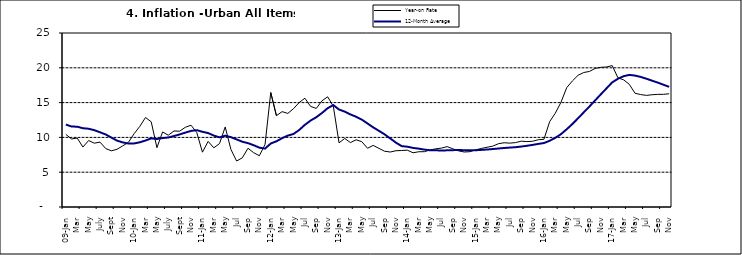
| Category | Year-on Rate | 12-Month Average |
|---|---|---|
| 09-Jan | 10.439 | 11.844 |
| Feb | 9.772 | 11.562 |
| Mar | 9.907 | 11.538 |
| Apr | 8.618 | 11.319 |
| May | 9.547 | 11.246 |
| June | 9.17 | 11.039 |
| July | 9.325 | 10.738 |
| Aug | 8.401 | 10.424 |
| Sept | 8.07 | 9.973 |
| Oct | 8.3 | 9.535 |
| Nov | 8.781 | 9.278 |
| Dec | 9.298 | 9.117 |
| 10-Jan | 10.534 | 9.136 |
| Feb | 11.584 | 9.297 |
| Mar | 12.864 | 9.555 |
| Apr | 12.24 | 9.859 |
| May | 8.524 | 9.769 |
| June | 10.781 | 9.904 |
| July | 10.313 | 9.987 |
| Aug | 10.924 | 10.197 |
| Sept | 10.891 | 10.43 |
| Oct | 11.457 | 10.689 |
| Nov | 11.748 | 10.932 |
| Dec | 10.699 | 11.042 |
| 11-Jan | 7.878 | 10.806 |
| Feb | 9.426 | 10.623 |
| Mar | 8.498 | 10.26 |
| Apr | 9.11 | 10.005 |
| May | 11.5 | 10.249 |
| Jun | 8.278 | 10.034 |
| Jul | 6.608 | 9.711 |
| Aug | 7.061 | 9.38 |
| Sep | 8.443 | 9.178 |
| Oct | 7.802 | 8.88 |
| Nov | 7.365 | 8.525 |
| Dec | 8.993 | 8.395 |
| 12-Jan | 16.445 | 9.119 |
| Feb | 13.123 | 9.443 |
| Mar | 13.701 | 9.889 |
| Apr | 13.447 | 10.259 |
| May | 14.127 | 10.496 |
| Jun | 15.012 | 11.062 |
| Jul | 15.63 | 11.81 |
| Aug | 14.456 | 12.422 |
| Sep | 14.162 | 12.893 |
| Oct | 15.26 | 13.506 |
| Nov | 15.836 | 14.199 |
| Dec | 14.459 | 14.637 |
| 13-Jan | 9.22 | 14.006 |
| Feb | 9.85 | 13.703 |
| Mar | 9.253 | 13.302 |
| Apr | 9.657 | 12.966 |
| May | 9.385 | 12.557 |
| Jun | 8.441 | 11.999 |
| Jul | 8.849 | 11.443 |
| Aug | 8.431 | 10.946 |
| Sep | 8.013 | 10.44 |
| Oct | 7.9 | 9.849 |
| Nov | 8.086 | 9.245 |
| Dec | 8.117 | 8.75 |
| 14-Jan | 8.164 | 8.662 |
| Feb | 7.791 | 8.493 |
| Mar | 7.937 | 8.384 |
| Apr | 7.947 | 8.246 |
| May | 8.195 | 8.151 |
| Jun | 8.358 | 8.146 |
| Jul | 8.464 | 8.118 |
| Aug | 8.673 | 8.141 |
| Sep | 8.357 | 8.17 |
| Oct | 8.064 | 8.182 |
| Nov | 7.902 | 8.165 |
| Dec | 7.948 | 8.151 |
| 15-Jan | 8.211 | 8.155 |
| Feb | 8.412 | 8.206 |
| Mar | 8.579 | 8.26 |
| Apr | 8.742 | 8.326 |
| May | 9.092 | 8.403 |
| Jun | 9.232 | 8.478 |
| Jul | 9.177 | 8.54 |
| Aug | 9.25 | 8.591 |
| Sep | 9.455 | 8.684 |
| Oct | 9.398 | 8.795 |
| Nov | 9.442 | 8.922 |
| Dec | 9.665 | 9.064 |
| 16-Jan | 9.728 | 9.19 |
| Feb | 12.254 | 9.516 |
| Mar | 13.485 | 9.935 |
| Apr | 15.052 | 10.474 |
| May | 17.148 | 11.165 |
| Jun | 18.111 | 11.925 |
| Jul | 18.927 | 12.754 |
| Aug | 19.325 | 13.605 |
| Sep | 19.476 | 14.444 |
| Oct | 19.914 | 15.318 |
| Nov | 20.067 | 16.193 |
| Dec | 20.118 | 17.05 |
| 17-Jan | 20.315 | 17.914 |
| Feb | 18.569 | 18.418 |
| Mar | 18.27 | 18.794 |
| Apr | 17.621 | 18.982 |
| May | 16.343 | 18.883 |
| Jun | 16.153 | 18.692 |
| Jul | 16.038 | 18.43 |
| Aug | 16.128 | 18.151 |
| Sep | 16.183 | 17.872 |
| Oct | 16.187 | 17.567 |
| Nov | 16.267 | 17.264 |